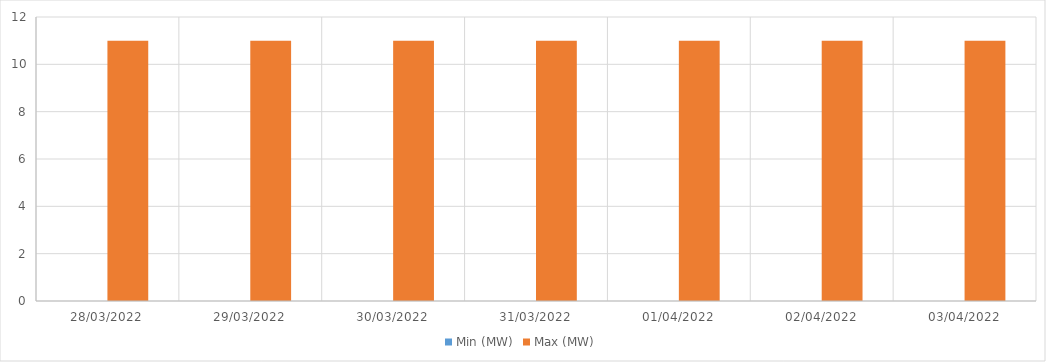
| Category | Min (MW) | Max (MW) |
|---|---|---|
| 28/03/2022 | 0 | 11 |
| 29/03/2022 | 0 | 11 |
| 30/03/2022 | 0 | 11 |
| 31/03/2022 | 0 | 11 |
| 01/04/2022 | 0 | 11 |
| 02/04/2022 | 0 | 11 |
| 03/04/2022 | 0 | 11 |